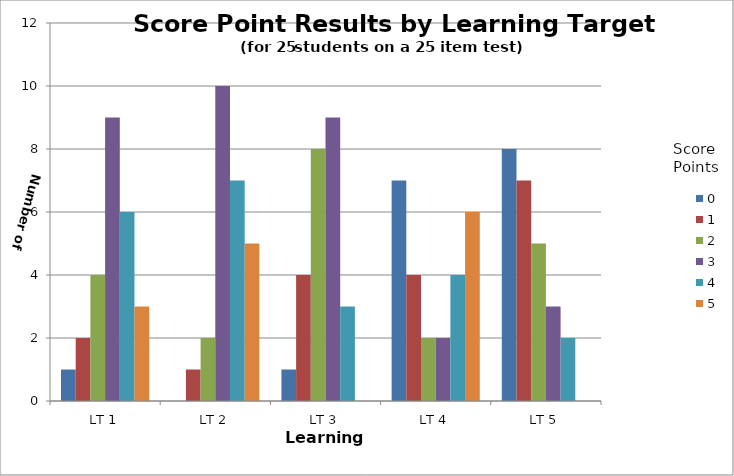
| Category | 0 | 1 | 2 | 3 | 4 | 5 |
|---|---|---|---|---|---|---|
| LT 1 | 1 | 2 | 4 | 9 | 6 | 3 |
| LT 2 | 0 | 1 | 2 | 10 | 7 | 5 |
| LT 3 | 1 | 4 | 8 | 9 | 3 | 0 |
| LT 4 | 7 | 4 | 2 | 2 | 4 | 6 |
| LT 5 | 8 | 7 | 5 | 3 | 2 | 0 |